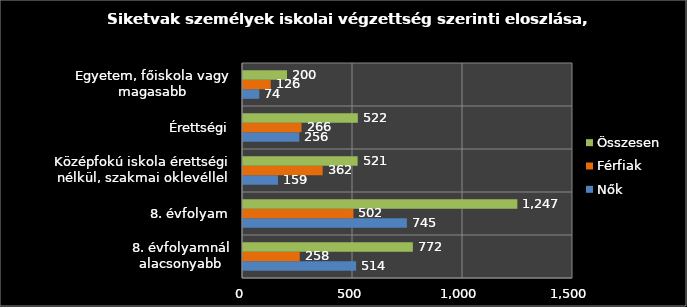
| Category | Nők | Férfiak | Összesen |
|---|---|---|---|
| 8. évfolyamnál alacsonyabb | 514 | 258 | 772 |
| 8. évfolyam | 745 | 502 | 1247 |
| Középfokú iskola érettségi nélkül, szakmai oklevéllel | 159 | 362 | 521 |
| Érettségi | 256 | 266 | 522 |
| Egyetem, főiskola vagy magasabb | 74 | 126 | 200 |